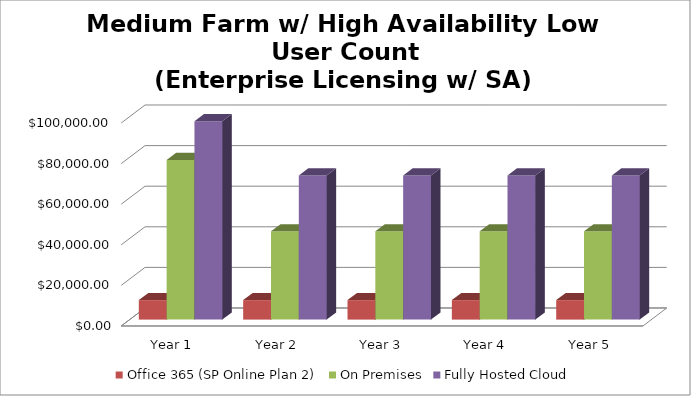
| Category | Office 365 (SP Online Plan 2) | On Premises | Fully Hosted Cloud |
|---|---|---|---|
| Year 1 | 9600 | 78643.177 | 97680 |
| Year 2 | 9600 | 43476.51 | 70980 |
| Year 3 | 9600 | 43476.51 | 70980 |
| Year 4 | 9600 | 43476.51 | 70980 |
| Year 5 | 9600 | 43476.51 | 70980 |